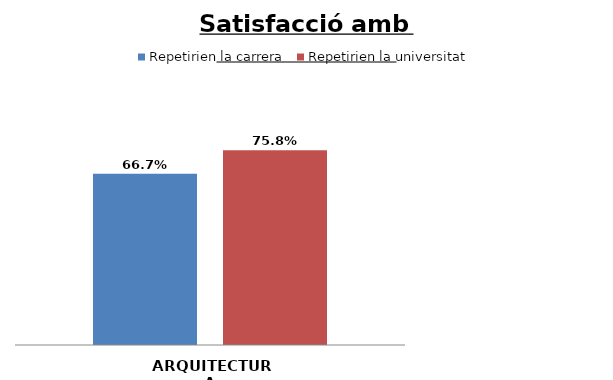
| Category | Repetirien la carrera | Repetirien la universitat |
|---|---|---|
| ARQUITECTURA | 0.667 | 0.758 |